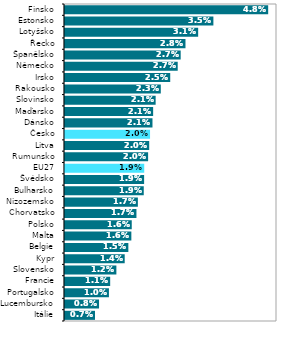
| Category | Series 0 |
|---|---|
| Itálie | 0.007 |
| Lucembursko | 0.008 |
| Portugalsko | 0.01 |
| Francie | 0.011 |
| Slovensko | 0.012 |
| Kypr | 0.014 |
| Belgie | 0.015 |
| Malta | 0.016 |
| Polsko | 0.016 |
| Chorvatsko | 0.017 |
| Nizozemsko | 0.017 |
| Bulharsko | 0.019 |
| Švédsko | 0.019 |
| EU27 | 0.019 |
| Rumunsko | 0.02 |
| Litva | 0.02 |
| Česko | 0.02 |
| Dánsko | 0.021 |
| Maďarsko | 0.021 |
| Slovinsko | 0.021 |
| Rakousko | 0.023 |
| Irsko | 0.025 |
| Německo | 0.027 |
| Španělsko | 0.027 |
| Řecko | 0.028 |
| Lotyšsko | 0.031 |
| Estonsko | 0.035 |
| Finsko | 0.048 |